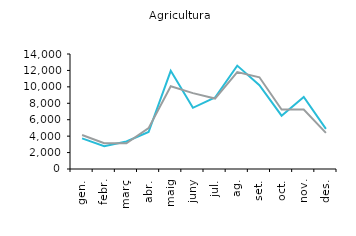
| Category | 2015 | 2016 |
|---|---|---|
| gen. | 3723 | 4134 |
| febr. | 2781 | 3130 |
| març | 3350 | 3130 |
| abr. | 4508 | 4972 |
| maig | 11950 | 10075 |
| juny | 7446 | 9240 |
| jul. | 8702 | 8573 |
| ag. | 12585 | 11809 |
| set. | 10203 | 11164 |
| oct. | 6488 | 7240 |
| nov. | 8780 | 7251 |
| des. | 4892 | 4404 |